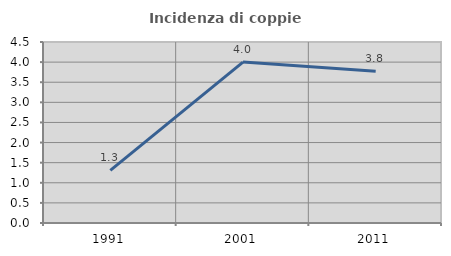
| Category | Incidenza di coppie miste |
|---|---|
| 1991.0 | 1.31 |
| 2001.0 | 4 |
| 2011.0 | 3.77 |